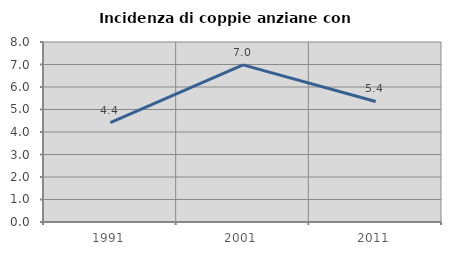
| Category | Incidenza di coppie anziane con figli |
|---|---|
| 1991.0 | 4.412 |
| 2001.0 | 6.985 |
| 2011.0 | 5.357 |